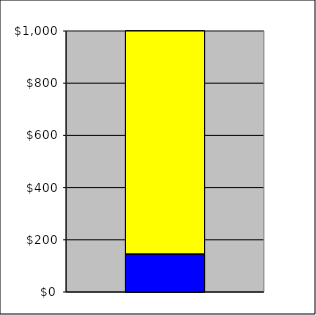
| Category | Series 0 | Series 1 |
|---|---|---|
| 0 | 146.1 | 853.9 |